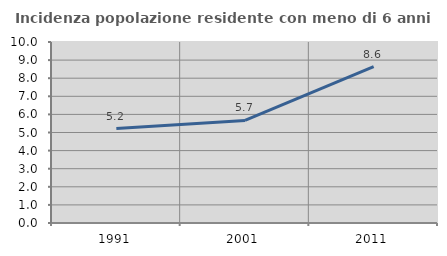
| Category | Incidenza popolazione residente con meno di 6 anni |
|---|---|
| 1991.0 | 5.221 |
| 2001.0 | 5.664 |
| 2011.0 | 8.633 |